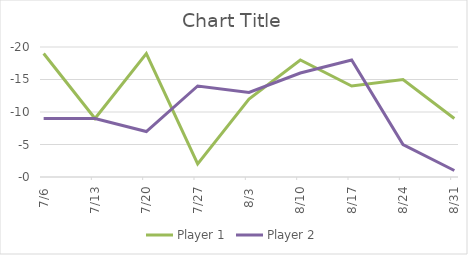
| Category | Player 1 | Player 2 |
|---|---|---|
| 2014-07-06 | 19 | 9 |
| 2014-07-13 | 9 | 9 |
| 2014-07-20 | 19 | 7 |
| 2014-07-27 | 2 | 14 |
| 2014-08-03 | 12 | 13 |
| 2014-08-10 | 18 | 16 |
| 2014-08-17 | 14 | 18 |
| 2014-08-24 | 15 | 5 |
| 2014-08-31 | 9 | 1 |